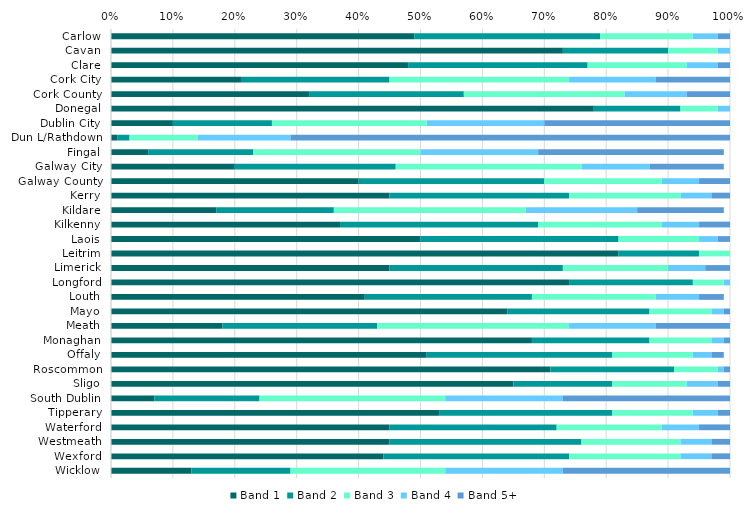
| Category | Band 1 | Band 2 | Band 3 | Band 4 | Band 5+ |
|---|---|---|---|---|---|
| Carlow | 0.49 | 0.3 | 0.15 | 0.04 | 0.02 |
| Cavan | 0.73 | 0.17 | 0.08 | 0.02 | 0.01 |
| Clare | 0.48 | 0.29 | 0.16 | 0.05 | 0.03 |
| Cork City | 0.21 | 0.24 | 0.29 | 0.14 | 0.12 |
| Cork County | 0.32 | 0.25 | 0.26 | 0.1 | 0.07 |
| Donegal | 0.78 | 0.14 | 0.06 | 0.02 | 0.01 |
| Dublin City | 0.1 | 0.16 | 0.25 | 0.19 | 0.3 |
| Dun L/Rathdown | 0.01 | 0.02 | 0.11 | 0.15 | 0.71 |
| Fingal | 0.06 | 0.17 | 0.27 | 0.19 | 0.3 |
| Galway City | 0.2 | 0.26 | 0.3 | 0.11 | 0.12 |
| Galway County | 0.4 | 0.3 | 0.19 | 0.06 | 0.05 |
| Kerry | 0.45 | 0.29 | 0.18 | 0.05 | 0.03 |
| Kildare | 0.17 | 0.19 | 0.31 | 0.18 | 0.14 |
| Kilkenny | 0.37 | 0.32 | 0.2 | 0.06 | 0.05 |
| Laois | 0.5 | 0.32 | 0.13 | 0.03 | 0.02 |
| Leitrim | 0.82 | 0.13 | 0.05 | 0.01 | 0 |
| Limerick | 0.45 | 0.28 | 0.17 | 0.06 | 0.04 |
| Longford | 0.74 | 0.2 | 0.05 | 0.01 | 0 |
| Louth | 0.41 | 0.27 | 0.2 | 0.07 | 0.04 |
| Mayo | 0.64 | 0.23 | 0.1 | 0.02 | 0.02 |
| Meath | 0.18 | 0.25 | 0.31 | 0.14 | 0.12 |
| Monaghan | 0.68 | 0.19 | 0.1 | 0.02 | 0.01 |
| Offaly | 0.51 | 0.3 | 0.13 | 0.03 | 0.02 |
| Roscommon | 0.71 | 0.2 | 0.07 | 0.01 | 0.01 |
| Sligo | 0.65 | 0.16 | 0.12 | 0.05 | 0.03 |
| South Dublin | 0.07 | 0.17 | 0.3 | 0.19 | 0.27 |
| Tipperary | 0.53 | 0.28 | 0.13 | 0.04 | 0.02 |
| Waterford | 0.45 | 0.27 | 0.17 | 0.06 | 0.05 |
| Westmeath | 0.45 | 0.31 | 0.16 | 0.05 | 0.03 |
| Wexford | 0.44 | 0.3 | 0.18 | 0.05 | 0.03 |
| Wicklow | 0.13 | 0.16 | 0.25 | 0.19 | 0.27 |